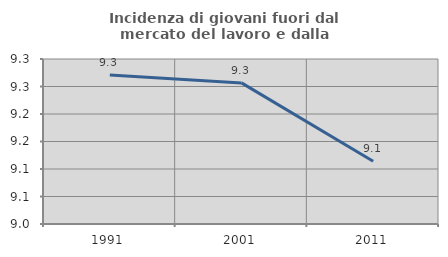
| Category | Incidenza di giovani fuori dal mercato del lavoro e dalla formazione  |
|---|---|
| 1991.0 | 9.271 |
| 2001.0 | 9.257 |
| 2011.0 | 9.114 |